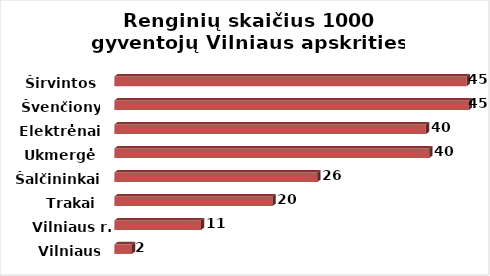
| Category | Series 0 |
|---|---|
| Vilniaus m. | 2.223 |
| Vilniaus r. | 10.998 |
| Trakai | 20.084 |
| Šalčininkai | 25.76 |
| Ukmergė | 39.962 |
| Elektrėnai | 39.543 |
| Švenčionys | 44.983 |
| Širvintos | 44.721 |